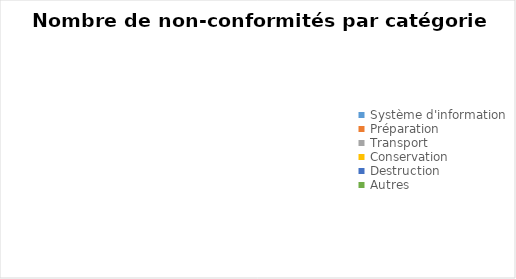
| Category | Series 0 |
|---|---|
| Système d'information | 0 |
| Préparation | 0 |
| Transport | 0 |
| Conservation | 0 |
| Destruction | 0 |
| Autres | 0 |